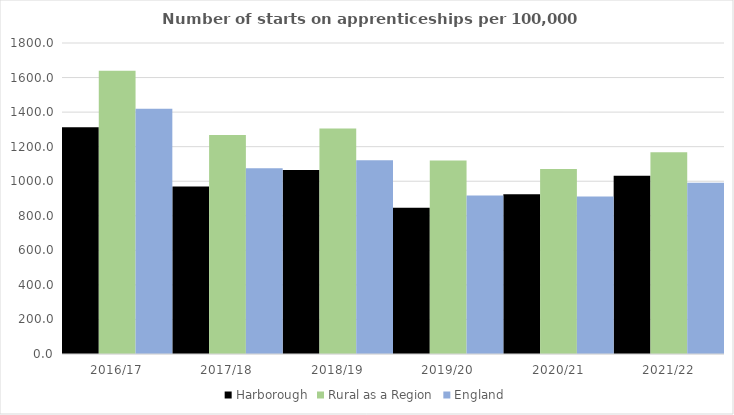
| Category | Harborough | Rural as a Region | England |
|---|---|---|---|
| 2016/17 | 1312 | 1638.789 | 1420 |
| 2017/18 | 969 | 1267.474 | 1075 |
| 2018/19 | 1065 | 1304.57 | 1122 |
| 2019/20 | 846 | 1119.662 | 918 |
| 2020/21 | 925 | 1070.748 | 912 |
| 2021/22 | 1032 | 1167.68 | 991 |